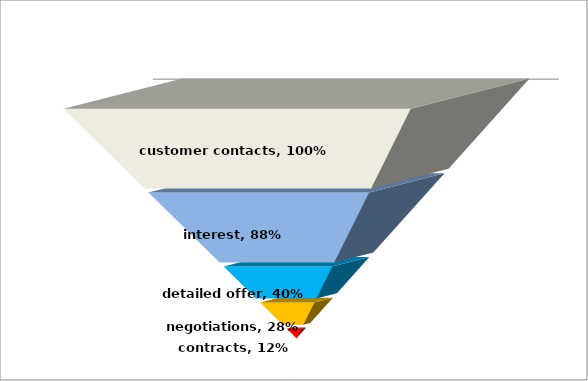
| Category | customer contacts | Series 1 | interest | Series 3 | detailed offer | Series 5 | negotiations | Series 7 | contracts |
|---|---|---|---|---|---|---|---|---|---|
| Numbers | 1 | 0.05 | 0.88 | 0.05 | 0.4 | 0.05 | 0.28 | 0.05 | 0.12 |